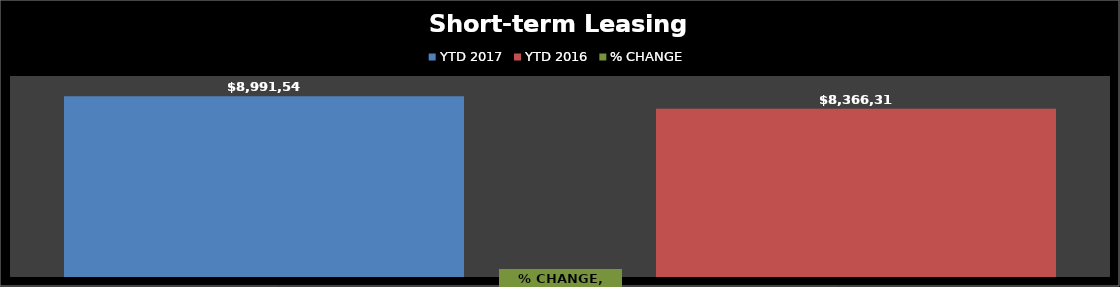
| Category | YTD 2017 | YTD 2016 |
|---|---|---|
| 0 | 8991549.45 | 8366318.55 |